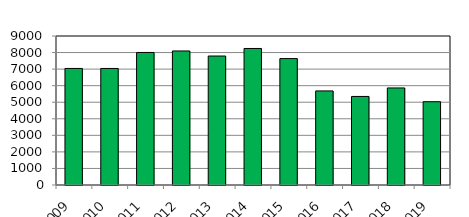
| Category | Series 1 |
|---|---|
| 2009 | 7040 |
| 2010 | 7039 |
| 2011 | 8006 |
| 2012 | 8096 |
| 2013 | 7791 |
| 2014 | 8246 |
| 2015 | 7636 |
| 2016 | 5683 |
| 2017 | 5349 |
| 2018 | 5862 |
| 2019 | 5030 |